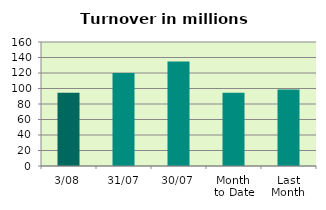
| Category | Series 0 |
|---|---|
| 3/08 | 94.375 |
| 31/07 | 120.142 |
| 30/07 | 134.773 |
| Month 
to Date | 94.375 |
| Last
Month | 98.668 |